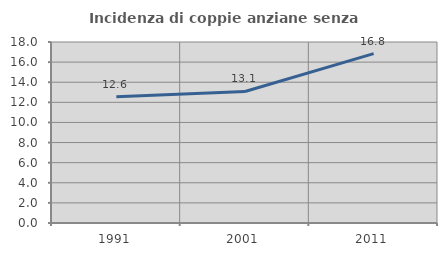
| Category | Incidenza di coppie anziane senza figli  |
|---|---|
| 1991.0 | 12.551 |
| 2001.0 | 13.08 |
| 2011.0 | 16.842 |